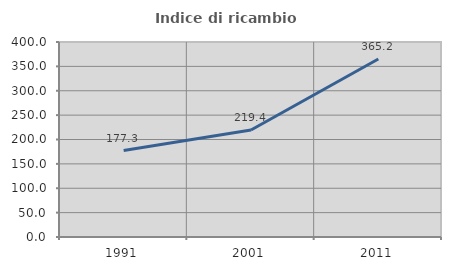
| Category | Indice di ricambio occupazionale  |
|---|---|
| 1991.0 | 177.273 |
| 2001.0 | 219.355 |
| 2011.0 | 365.179 |